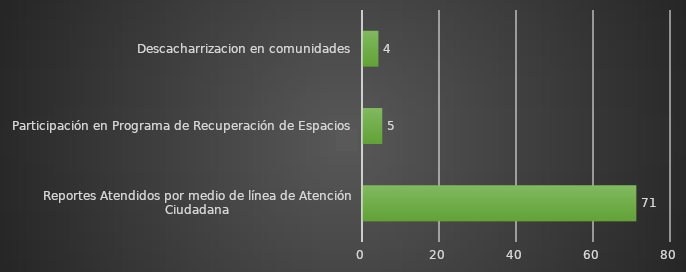
| Category | INDICADOR  |
|---|---|
| Reportes Atendidos por medio de línea de Atención Ciudadana | 71 |
| Participación en Programa de Recuperación de Espacios | 5 |
| Descacharrizacion en comunidades | 4 |